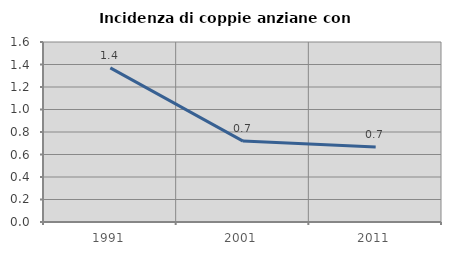
| Category | Incidenza di coppie anziane con figli |
|---|---|
| 1991.0 | 1.37 |
| 2001.0 | 0.719 |
| 2011.0 | 0.667 |